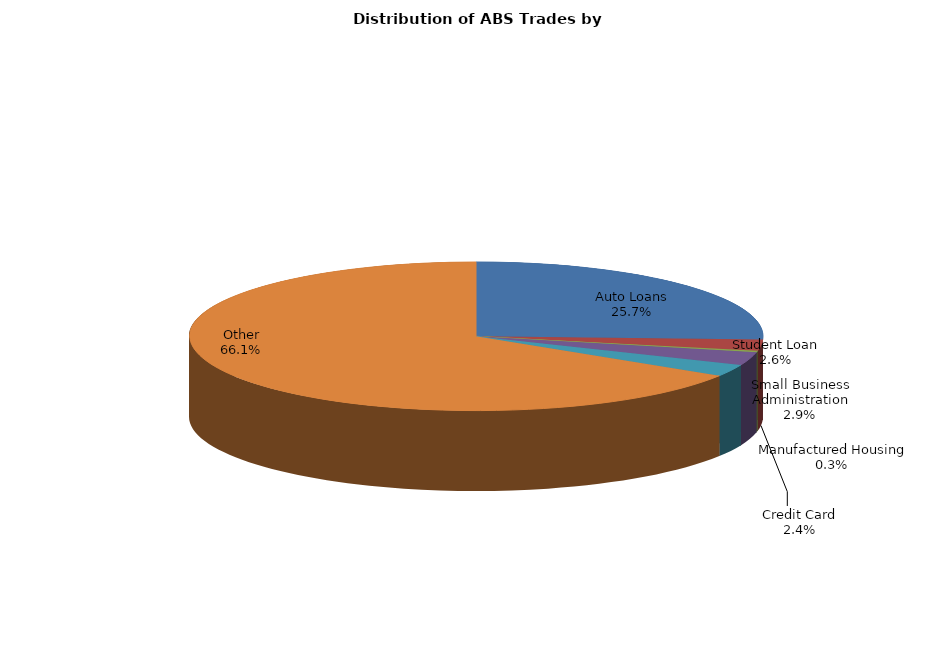
| Category | Series 0 |
|---|---|
| Auto Loans | 137.632 |
| Credit Card | 12.952 |
| Manufactured Housing | 1.728 |
| Small Business Administration | 15.444 |
| Student Loan | 13.844 |
| Other | 354.176 |